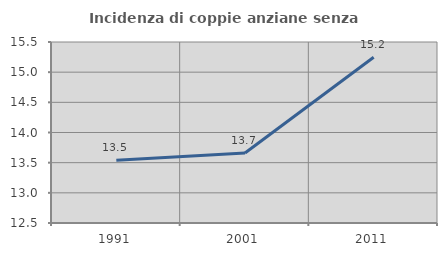
| Category | Incidenza di coppie anziane senza figli  |
|---|---|
| 1991.0 | 13.54 |
| 2001.0 | 13.66 |
| 2011.0 | 15.249 |